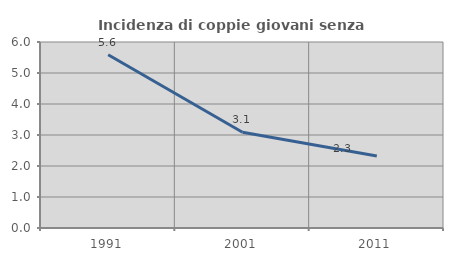
| Category | Incidenza di coppie giovani senza figli |
|---|---|
| 1991.0 | 5.587 |
| 2001.0 | 3.086 |
| 2011.0 | 2.326 |